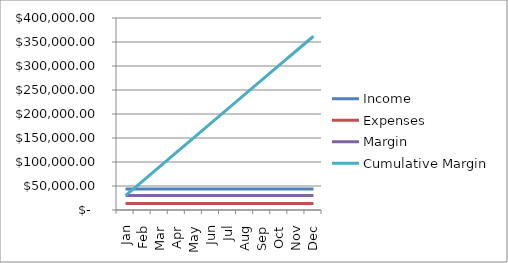
| Category | Income | Expenses | Margin | Cumulative Margin |
|---|---|---|---|---|
| Jan | 43643 | 13479 | 30164 | 30164 |
| Feb | 43643 | 13479 | 30164 | 60328 |
| Mar | 43643 | 13479 | 30164 | 90492 |
| Apr | 43643 | 13479 | 30164 | 120656 |
| May | 43643 | 13479 | 30164 | 150820 |
| Jun | 43643 | 13479 | 30164 | 180984 |
| Jul | 43643 | 13479 | 30164 | 211148 |
| Aug | 43643 | 13479 | 30164 | 241312 |
| Sep | 43643 | 13479 | 30164 | 271476 |
| Oct | 43643 | 13479 | 30164 | 301640 |
| Nov | 43643 | 13479 | 30164 | 331804 |
| Dec | 43643 | 13479 | 30164 | 361968 |